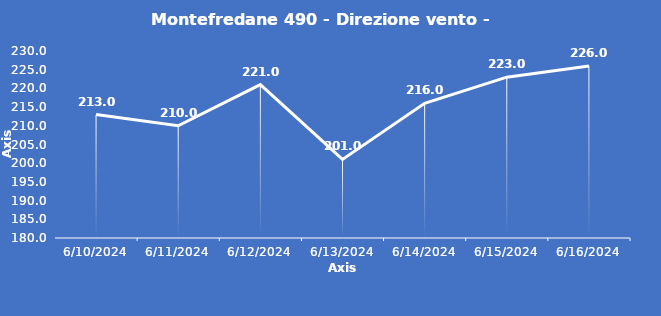
| Category | Montefredane 490 - Direzione vento - Grezzo (°N) |
|---|---|
| 6/10/24 | 213 |
| 6/11/24 | 210 |
| 6/12/24 | 221 |
| 6/13/24 | 201 |
| 6/14/24 | 216 |
| 6/15/24 | 223 |
| 6/16/24 | 226 |